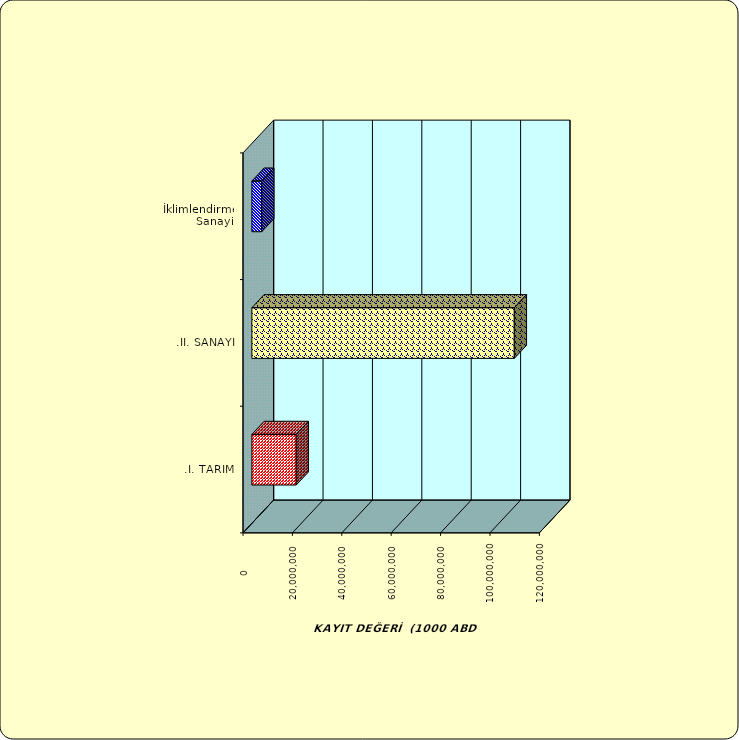
| Category | Series 0 |
|---|---|
| .I. TARIM | 17953412.906 |
| .II. SANAYİ | 106264446.761 |
|  İklimlendirme Sanayii | 4001777.068 |